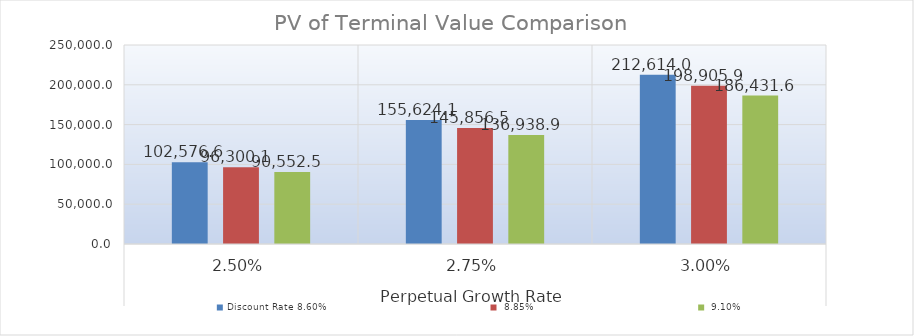
| Category | Discount Rate |
|---|---|
| 0 | 90552.515 |
| 1 | 136938.908 |
| 2 | 186431.616 |